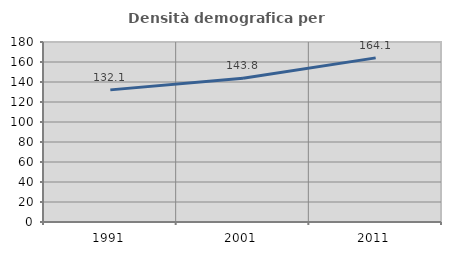
| Category | Densità demografica |
|---|---|
| 1991.0 | 132.125 |
| 2001.0 | 143.783 |
| 2011.0 | 164.11 |